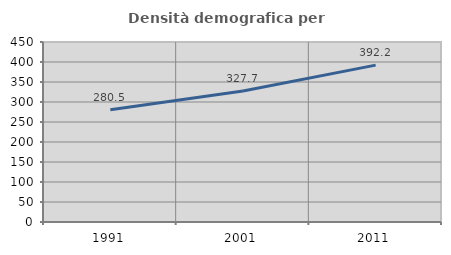
| Category | Densità demografica |
|---|---|
| 1991.0 | 280.536 |
| 2001.0 | 327.67 |
| 2011.0 | 392.177 |